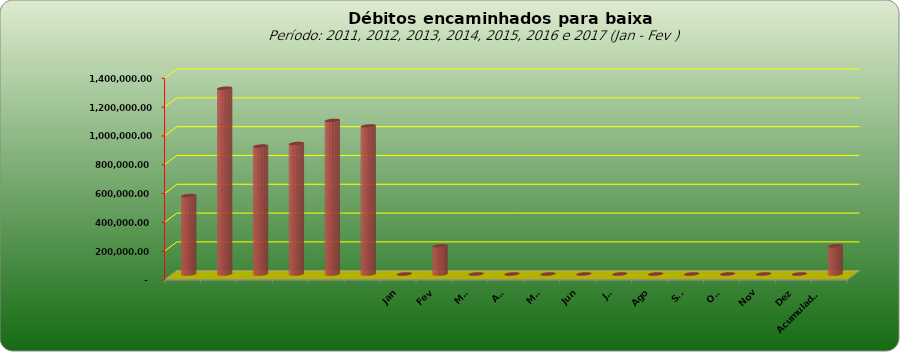
| Category |  543.796,20  |
|---|---|
|  | 543796.2 |
|  | 1289053.69 |
|  | 887573.08 |
|  | 905052.31 |
|  | 1065434.28 |
|  | 1027209.41 |
| Jan | 0 |
| Fev | 195564.55 |
| Mar | 0 |
| Abr | 0 |
| Mai | 0 |
| Jun | 0 |
| Jul | 0 |
| Ago | 0 |
| Set | 0 |
| Out | 0 |
| Nov | 0 |
| Dez | 0 |
| Acumulado
2016 | 195564.55 |